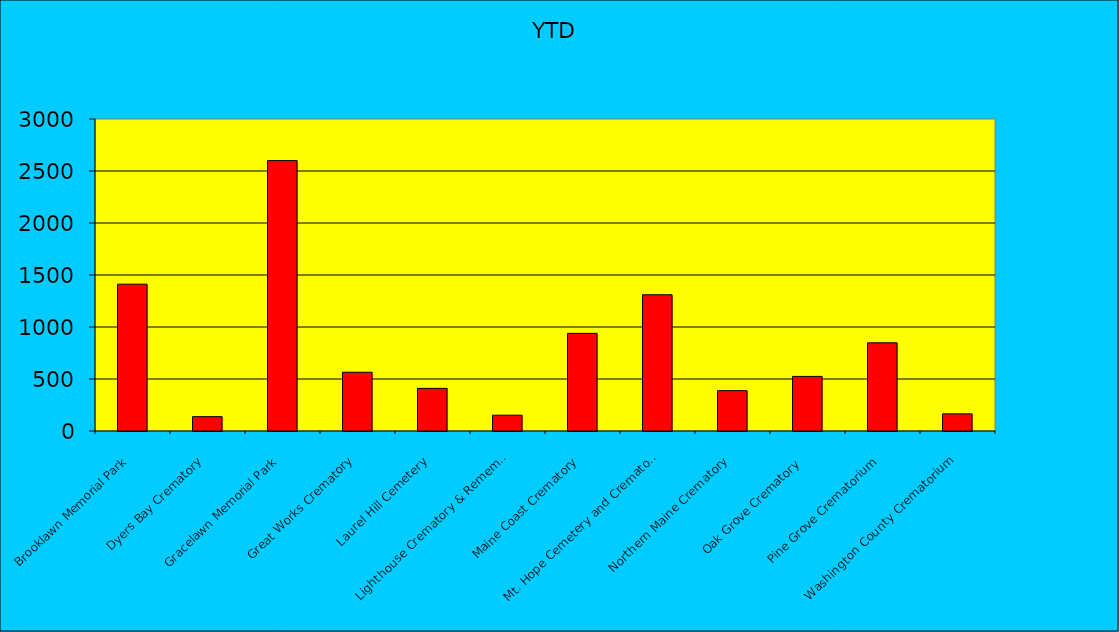
| Category | YTD |
|---|---|
| Brooklawn Memorial Park | 1412 |
| Dyers Bay Crematory | 138 |
| Gracelawn Memorial Park | 2600 |
| Great Works Crematory | 565 |
| Laurel Hill Cemetery | 410 |
| Lighthouse Crematory & Remembrance, Inc. | 152 |
| Maine Coast Crematory | 939 |
| Mt. Hope Cemetery and Crematory | 1310 |
| Northern Maine Crematory | 388 |
| Oak Grove Crematory  | 525 |
| Pine Grove Crematorium | 848 |
| Washington County Crematorium | 165 |